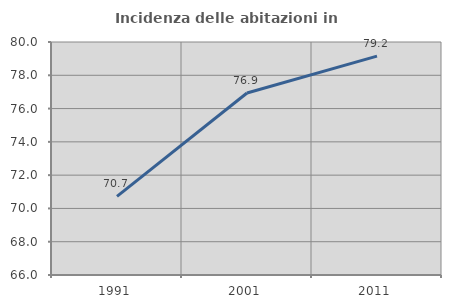
| Category | Incidenza delle abitazioni in proprietà  |
|---|---|
| 1991.0 | 70.724 |
| 2001.0 | 76.936 |
| 2011.0 | 79.154 |